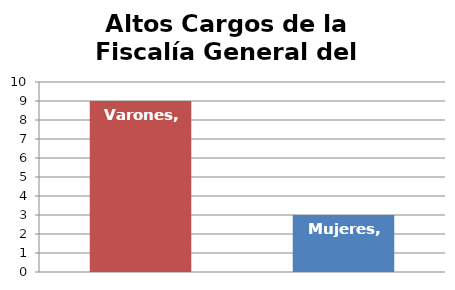
| Category | Altos Cargos de la Fiscalía General del Estado |
|---|---|
| Varones | 9 |
| Mujeres | 3 |